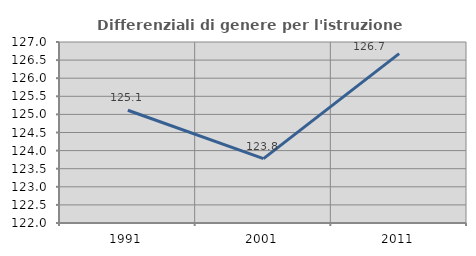
| Category | Differenziali di genere per l'istruzione superiore |
|---|---|
| 1991.0 | 125.114 |
| 2001.0 | 123.778 |
| 2011.0 | 126.679 |